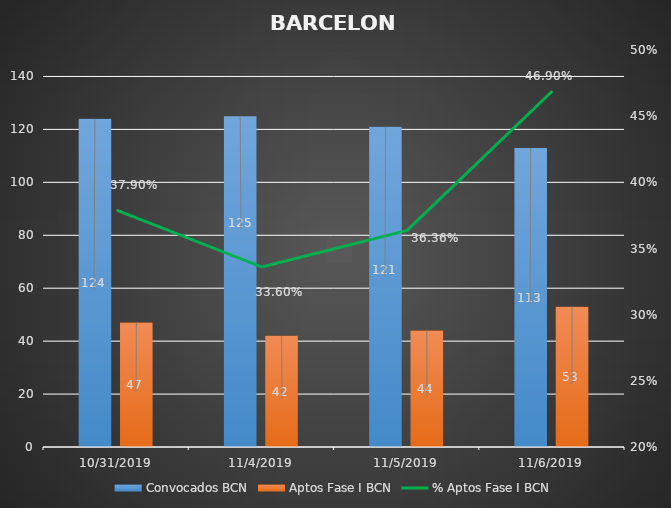
| Category | Convocados BCN | Aptos Fase I BCN |
|---|---|---|
| 10/31/19 | 124 | 47 |
| 11/4/19 | 125 | 42 |
| 11/5/19 | 121 | 44 |
| 11/6/19 | 113 | 53 |